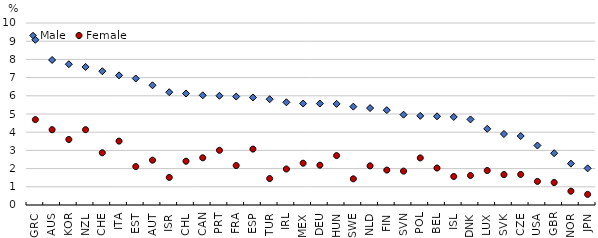
| Category | Male | Female |
|---|---|---|
| GRC | 9.078 | 4.691 |
| AUS | 7.967 | 4.137 |
| KOR | 7.735 | 3.599 |
| NZL | 7.584 | 4.139 |
| CHE | 7.352 | 2.87 |
| ITA | 7.123 | 3.51 |
| EST | 6.951 | 2.111 |
| AUT | 6.578 | 2.463 |
| ISR | 6.196 | 1.514 |
| CHL | 6.125 | 2.405 |
| CAN | 6.026 | 2.594 |
| PRT | 6.001 | 3.004 |
| FRA | 5.959 | 2.167 |
| ESP | 5.908 | 3.072 |
| TUR | 5.811 | 1.454 |
| IRL | 5.642 | 1.977 |
| MEX | 5.575 | 2.297 |
| DEU | 5.574 | 2.187 |
| HUN | 5.555 | 2.714 |
| SWE | 5.404 | 1.438 |
| NLD | 5.326 | 2.151 |
| FIN | 5.212 | 1.918 |
| SVN | 4.963 | 1.862 |
| POL | 4.898 | 2.587 |
| BEL | 4.874 | 2.031 |
| ISL | 4.837 | 1.566 |
| DNK | 4.703 | 1.621 |
| LUX | 4.185 | 1.894 |
| SVK | 3.901 | 1.671 |
| CZE | 3.79 | 1.678 |
| USA | 3.27 | 1.296 |
| GBR | 2.845 | 1.236 |
| NOR | 2.274 | 0.758 |
| JPN | 2.014 | 0.583 |